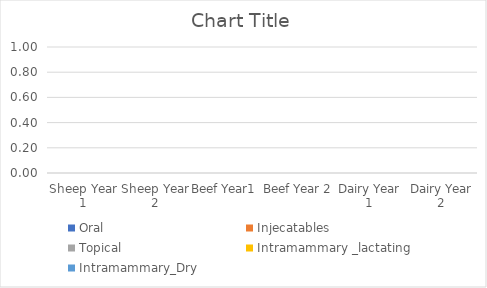
| Category | Oral | Injecatables | Topical | Intramammary _lactating  | Intramammary_Dry |
|---|---|---|---|---|---|
| Sheep Year 1 | 0 | 0 | 0 | 0 | 0 |
| Sheep Year 2 | 0 | 0 | 0 | 0 | 0 |
| Beef Year1  | 0 | 0 | 0 | 0 | 0 |
| Beef Year 2 | 0 | 0 | 0 | 0 | 0 |
| Dairy Year 1 | 0 | 0 | 0 | 0 | 0 |
| Dairy Year 2 | 0 | 0 | 0 | 0 | 0 |